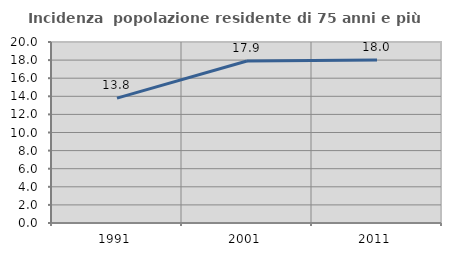
| Category | Incidenza  popolazione residente di 75 anni e più |
|---|---|
| 1991.0 | 13.8 |
| 2001.0 | 17.908 |
| 2011.0 | 18.004 |